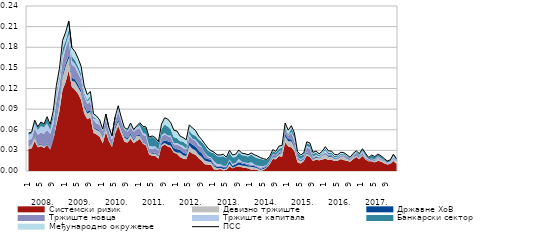
| Category | ПСС |
|---|---|
| 0 | 0.055 |
| 1 | 0.057 |
| 2 | 0.074 |
| 3 | 0.064 |
| 4 | 0.071 |
| 5 | 0.068 |
| 6 | 0.079 |
| 7 | 0.068 |
| 8 | 0.088 |
| 9 | 0.124 |
| 10 | 0.149 |
| 11 | 0.19 |
| 12 | 0.202 |
| 13 | 0.218 |
| 14 | 0.18 |
| 15 | 0.174 |
| 16 | 0.164 |
| 17 | 0.152 |
| 18 | 0.124 |
| 19 | 0.111 |
| 20 | 0.116 |
| 21 | 0.083 |
| 22 | 0.08 |
| 23 | 0.074 |
| 24 | 0.061 |
| 25 | 0.083 |
| 26 | 0.064 |
| 27 | 0.051 |
| 28 | 0.079 |
| 29 | 0.095 |
| 30 | 0.078 |
| 31 | 0.063 |
| 32 | 0.061 |
| 33 | 0.07 |
| 34 | 0.06 |
| 35 | 0.066 |
| 36 | 0.07 |
| 37 | 0.065 |
| 38 | 0.064 |
| 39 | 0.049 |
| 40 | 0.051 |
| 41 | 0.049 |
| 42 | 0.043 |
| 43 | 0.068 |
| 44 | 0.077 |
| 45 | 0.076 |
| 46 | 0.07 |
| 47 | 0.059 |
| 48 | 0.058 |
| 49 | 0.051 |
| 50 | 0.048 |
| 51 | 0.045 |
| 52 | 0.067 |
| 53 | 0.063 |
| 54 | 0.059 |
| 55 | 0.051 |
| 56 | 0.046 |
| 57 | 0.04 |
| 58 | 0.033 |
| 59 | 0.03 |
| 60 | 0.027 |
| 61 | 0.024 |
| 62 | 0.023 |
| 63 | 0.024 |
| 64 | 0.02 |
| 65 | 0.03 |
| 66 | 0.023 |
| 67 | 0.025 |
| 68 | 0.03 |
| 69 | 0.026 |
| 70 | 0.025 |
| 71 | 0.023 |
| 72 | 0.026 |
| 73 | 0.024 |
| 74 | 0.022 |
| 75 | 0.02 |
| 76 | 0.018 |
| 77 | 0.017 |
| 78 | 0.021 |
| 79 | 0.031 |
| 80 | 0.029 |
| 81 | 0.036 |
| 82 | 0.037 |
| 83 | 0.07 |
| 84 | 0.059 |
| 85 | 0.066 |
| 86 | 0.055 |
| 87 | 0.028 |
| 88 | 0.023 |
| 89 | 0.026 |
| 90 | 0.043 |
| 91 | 0.041 |
| 92 | 0.027 |
| 93 | 0.029 |
| 94 | 0.025 |
| 95 | 0.029 |
| 96 | 0.035 |
| 97 | 0.029 |
| 98 | 0.029 |
| 99 | 0.024 |
| 100 | 0.024 |
| 101 | 0.027 |
| 102 | 0.027 |
| 103 | 0.024 |
| 104 | 0.02 |
| 105 | 0.026 |
| 106 | 0.029 |
| 107 | 0.025 |
| 108 | 0.032 |
| 109 | 0.026 |
| 110 | 0.02 |
| 111 | 0.023 |
| 112 | 0.021 |
| 113 | 0.025 |
| 114 | 0.022 |
| 115 | 0.018 |
| 116 | 0.015 |
| 117 | 0.016 |
| 118 | 0.024 |
| 119 | 0.018 |